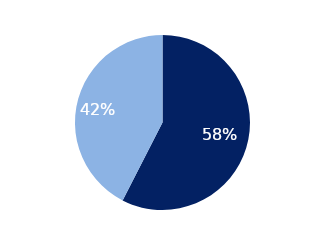
| Category | Series 0 |
|---|---|
| Percentage of optometry practices that were accredited | 0.575 |
| Percentage of optometry practices that were not accredited | 0.425 |